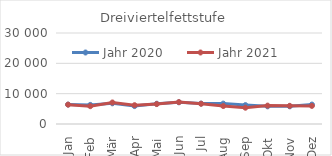
| Category | Jahr 2020 | Jahr 2021 |
|---|---|---|
| 0 | 6400.972 | 6381.537 |
| 1 | 6294.921 | 5875.364 |
| 2 | 6817.776 | 7096.412 |
| 3 | 5905.849 | 6200.271 |
| 4 | 6679.031 | 6568.4 |
| 5 | 7162.623 | 7218.87 |
| 6 | 6729.502 | 6674.469 |
| 7 | 6722.203 | 5919.61 |
| 8 | 6228.298 | 5370.099 |
| 9 | 5821.878 | 6061.836 |
| 10 | 5830.953 | 5987.903 |
| 11 | 6400.909 | 5968.755 |